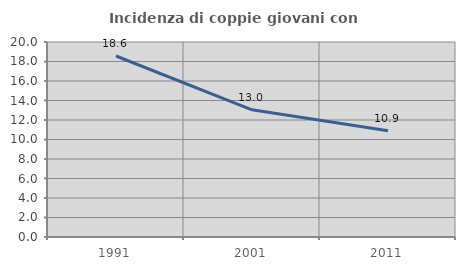
| Category | Incidenza di coppie giovani con figli |
|---|---|
| 1991.0 | 18.563 |
| 2001.0 | 13.049 |
| 2011.0 | 10.902 |